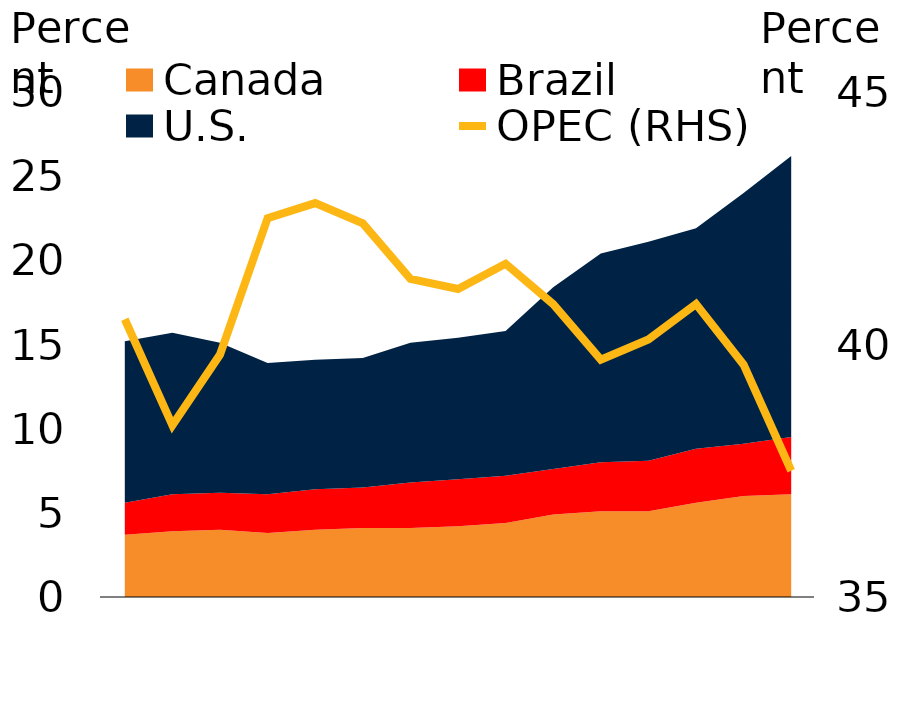
| Category | OPEC (RHS) |
|---|---|
| 2000 | 41.2 |
|   | 40.5 |
|   | 38.4 |
|   | 39.8 |
| 2004 | 41.8 |
|   | 42.5 |
|   | 42.8 |
|   | 42.4 |
| 2008 | 43.2 |
|   | 41.3 |
|   | 41.1 |
|   | 41.6 |
| 2012 | 42.2 |
|   | 40.8 |
|   | 39.7 |
|   | 40.1 |
| 2016 | 41.2 |
|   | 40.8 |
|   | 39.6 |
| 2019 | 37.5 |